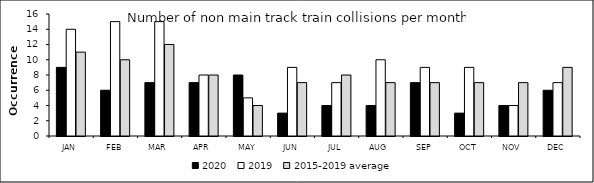
| Category | 2020 | 2019 | 2015-2019 average |
|---|---|---|---|
| JAN | 9 | 14 | 11 |
| FEB | 6 | 15 | 10 |
| MAR | 7 | 15 | 12 |
| APR | 7 | 8 | 8 |
| MAY | 8 | 5 | 4 |
| JUN | 3 | 9 | 7 |
| JUL | 4 | 7 | 8 |
| AUG | 4 | 10 | 7 |
| SEP | 7 | 9 | 7 |
| OCT | 3 | 9 | 7 |
| NOV | 4 | 4 | 7 |
| DEC | 6 | 7 | 9 |